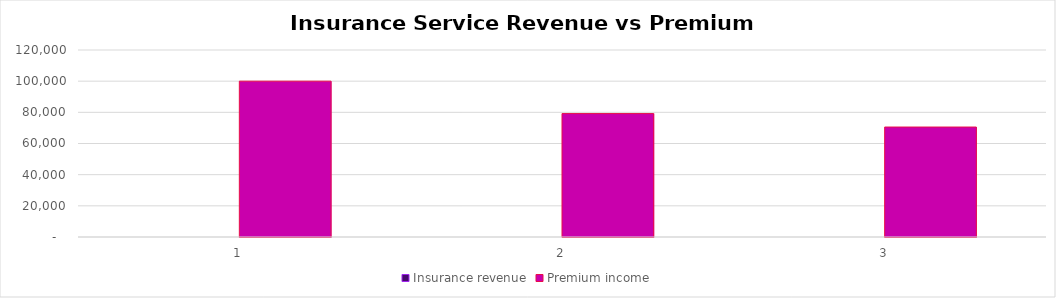
| Category | Insurance revenue | Premium income |
|---|---|---|
| 1.0 | 0 | 100000 |
| 2.0 | 0 | 79200 |
| 3.0 | 0 | 70567.2 |